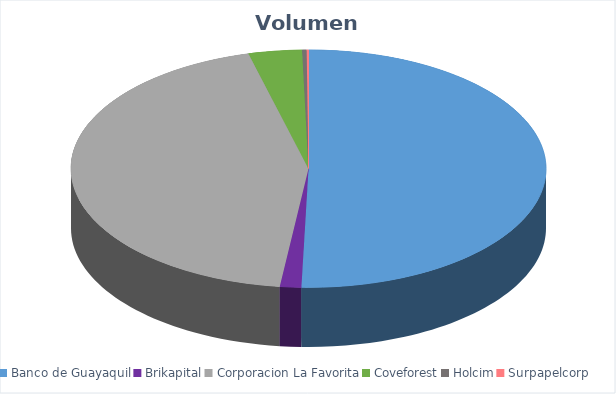
| Category | VOLUMEN ($USD) |
|---|---|
| Banco de Guayaquil | 34718.4 |
| Brikapital | 1000 |
| Corporacion La Favorita | 30266.59 |
| Coveforest | 2501.2 |
| Holcim | 209.88 |
| Surpapelcorp | 85 |